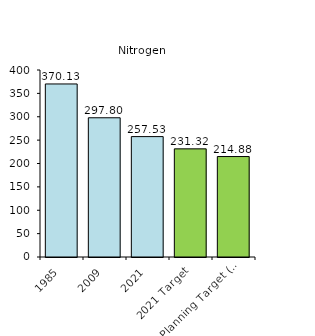
| Category | Series 0 |
|---|---|
| 1985 | 370.135 |
| 2009 | 297.801 |
| 2021 | 257.526 |
| 2021 Target | 231.324 |
| 2025 Planning Target (amt. allowed in Bay)  | 214.877 |